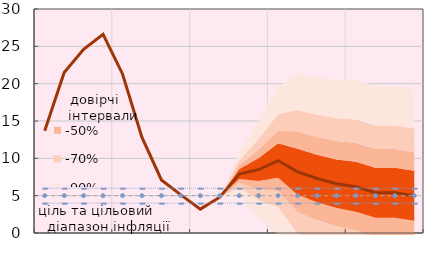
| Category | Series 8 | Series 10 | Series 11 | Series 12 |
|---|---|---|---|---|
|  | 13.7 | 4 | 5 | 6 |
|  | 21.5 | 4 | 5 | 6 |
|  | 24.6 | 4 | 5 | 6 |
| IV.22 | 26.6 | 4 | 5 | 6 |
|  | 21.3 | 4 | 5 | 6 |
|  | 12.8 | 4 | 5 | 6 |
|  | 7.1 | 4 | 5 | 6 |
| IV.23 | 5.1 | 4 | 5 | 6 |
|  | 3.2 | 4 | 5 | 6 |
|  | 4.8 | 4 | 5 | 6 |
|  | 7.9 | 4 | 5 | 6 |
| IV.24 | 8.5 | 4 | 5 | 6 |
|  | 9.7 | 4 | 5 | 6 |
|  | 8.2 | 4 | 5 | 6 |
|  | 7.3 | 4 | 5 | 6 |
| IV.25 | 6.6 | 4 | 5 | 6 |
|  | 6.2 | 4 | 5 | 6 |
|  | 5.4 | 4 | 5 | 6 |
|  | 5.4 | 4 | 5 | 6 |
| IV.26 | 5 | 4 | 5 | 6 |